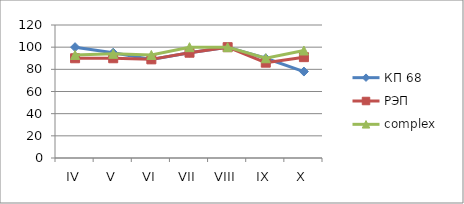
| Category | КП 68 | РЭП  | complex |
|---|---|---|---|
| IV | 100 | 90 | 93 |
| V | 95 | 90 | 94 |
| VI | 89 | 89 | 93 |
| VII | 95 | 95 | 100 |
| VIII | 100 | 100 | 100 |
| IX | 90 | 86 | 90 |
| X | 78 | 91 | 97 |